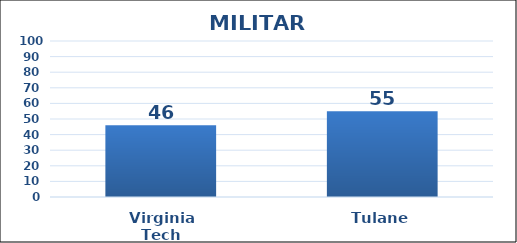
| Category | Series 0 |
|---|---|
| Virginia Tech | 46 |
| Tulane | 55 |